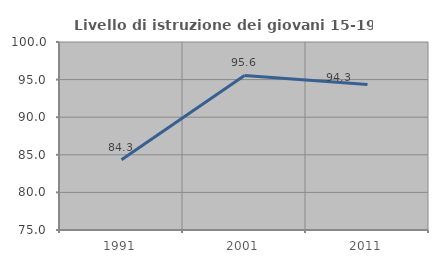
| Category | Livello di istruzione dei giovani 15-19 anni |
|---|---|
| 1991.0 | 84.335 |
| 2001.0 | 95.56 |
| 2011.0 | 94.336 |